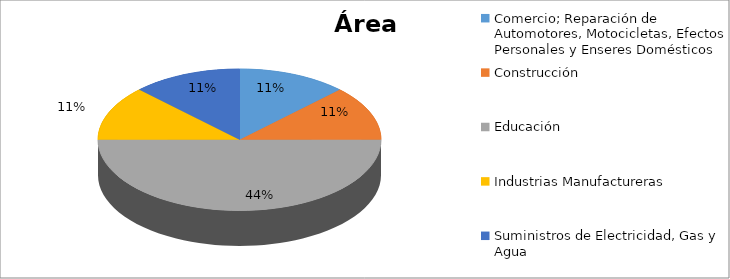
| Category | Series 0 |
|---|---|
| Comercio; Reparación de Automotores, Motocicletas, Efectos Personales y Enseres Domésticos | 0.111 |
| Construcción | 0.111 |
| Educación | 0.444 |
| Industrias Manufactureras | 0.111 |
| Suministros de Electricidad, Gas y Agua | 0.111 |